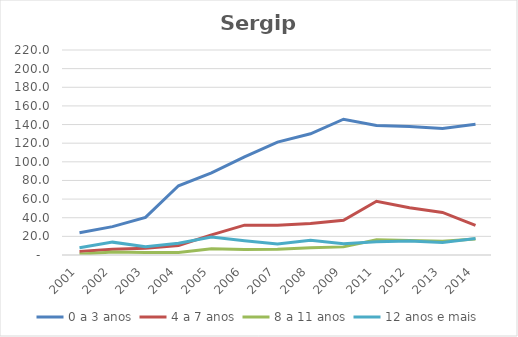
| Category | 0 a 3 anos | 4 a 7 anos | 8 a 11 anos | 12 anos e mais |
|---|---|---|---|---|
| 2001.0 | 23.947 | 3.83 | 0.838 | 7.747 |
| 2002.0 | 30.469 | 6.091 | 3.174 | 13.798 |
| 2003.0 | 40.354 | 7.145 | 2.801 | 8.769 |
| 2004.0 | 74.303 | 10.228 | 2.701 | 12.688 |
| 2005.0 | 88.144 | 21.618 | 6.806 | 19.33 |
| 2006.0 | 105.28 | 32.055 | 5.847 | 15.189 |
| 2007.0 | 121.216 | 31.862 | 6.156 | 11.686 |
| 2008.0 | 130.065 | 33.723 | 7.859 | 15.905 |
| 2009.0 | 145.712 | 37.214 | 8.717 | 11.995 |
| 2011.0 | 138.895 | 57.716 | 16.306 | 14.329 |
| 2012.0 | 137.85 | 50.677 | 15.604 | 14.989 |
| 2013.0 | 135.843 | 45.699 | 14.729 | 13.409 |
| 2014.0 | 140.265 | 31.873 | 17.209 | 17.667 |